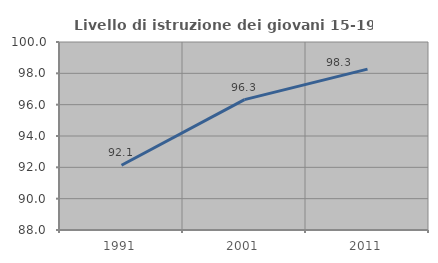
| Category | Livello di istruzione dei giovani 15-19 anni |
|---|---|
| 1991.0 | 92.132 |
| 2001.0 | 96.321 |
| 2011.0 | 98.268 |